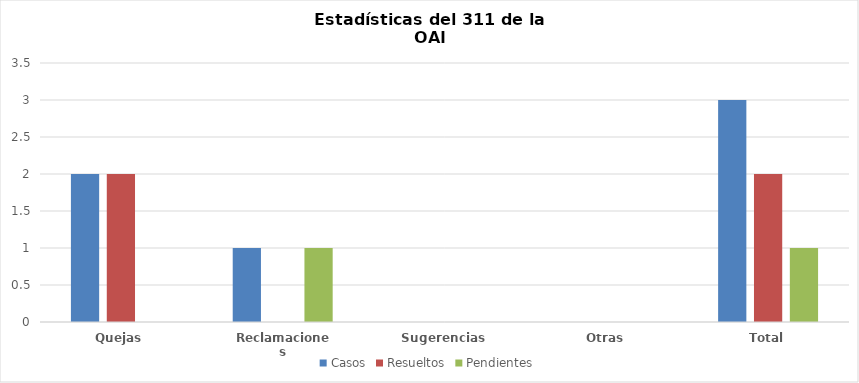
| Category | Casos | Resueltos | Pendientes |
|---|---|---|---|
| Quejas | 2 | 2 | 0 |
| Reclamaciones | 1 | 0 | 1 |
| Sugerencias | 0 | 0 | 0 |
| Otras | 0 | 0 | 0 |
| Total | 3 | 2 | 1 |